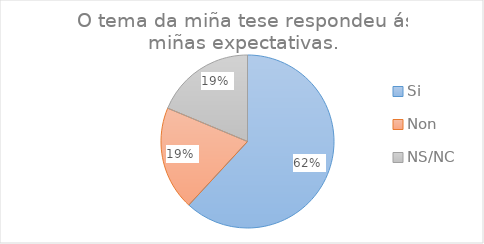
| Category | Series 25 |
|---|---|
| Si | 86 |
| Non | 27 |
| NS/NC | 26 |